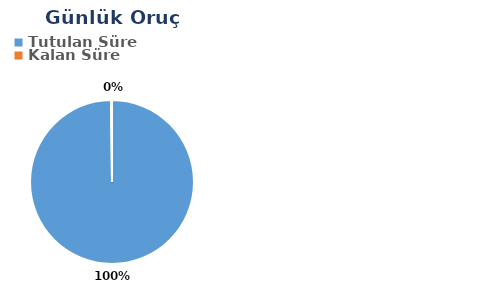
| Category | Günlük |
|---|---|
| Tutulan Süre | 0.584 |
| Kalan Süre | 0.001 |